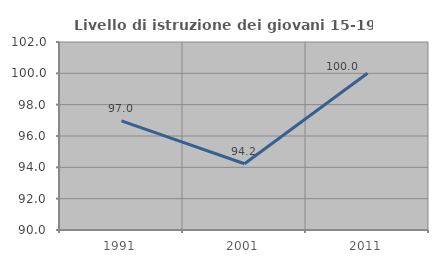
| Category | Livello di istruzione dei giovani 15-19 anni |
|---|---|
| 1991.0 | 96.97 |
| 2001.0 | 94.231 |
| 2011.0 | 100 |